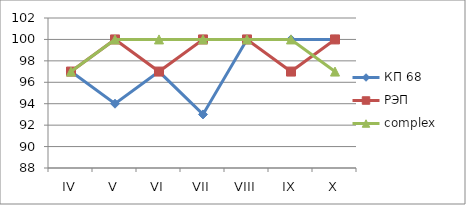
| Category | КП 68 | РЭП  | complex |
|---|---|---|---|
| IV | 97 | 97 | 97 |
| V | 94 | 100 | 100 |
| VI | 97 | 97 | 100 |
| VII | 93 | 100 | 100 |
| VIII | 100 | 100 | 100 |
| IX | 100 | 97 | 100 |
| X | 100 | 100 | 97 |